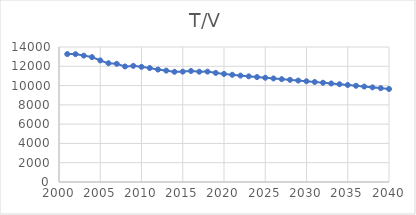
| Category | T/V |
|---|---|
| 2001.0 | 13266.492 |
| 2002.0 | 13256.972 |
| 2003.0 | 13106.6 |
| 2004.0 | 12949.357 |
| 2005.0 | 12607.211 |
| 2006.0 | 12314.917 |
| 2007.0 | 12254.349 |
| 2008.0 | 11981.017 |
| 2009.0 | 12041.21 |
| 2010.0 | 11944.66 |
| 2011.0 | 11817.286 |
| 2012.0 | 11661.479 |
| 2013.0 | 11551.975 |
| 2014.0 | 11430.228 |
| 2015.0 | 11443.981 |
| 2016.0 | 11512.3 |
| 2017.0 | 11437.871 |
| 2018.0 | 11446.241 |
| 2019.0 | 11314.35 |
| 2020.0 | 11208.345 |
| 2021.0 | 11117.193 |
| 2022.0 | 11034.989 |
| 2023.0 | 10957.994 |
| 2024.0 | 10883.859 |
| 2025.0 | 10811.122 |
| 2026.0 | 10738.872 |
| 2027.0 | 10666.542 |
| 2028.0 | 10593.773 |
| 2029.0 | 10520.339 |
| 2030.0 | 10446.092 |
| 2031.0 | 10370.936 |
| 2032.0 | 10294.802 |
| 2033.0 | 10217.642 |
| 2034.0 | 10139.419 |
| 2035.0 | 10060.102 |
| 2036.0 | 9979.664 |
| 2037.0 | 9898.08 |
| 2038.0 | 9815.328 |
| 2039.0 | 9731.384 |
| 2040.0 | 9646.226 |